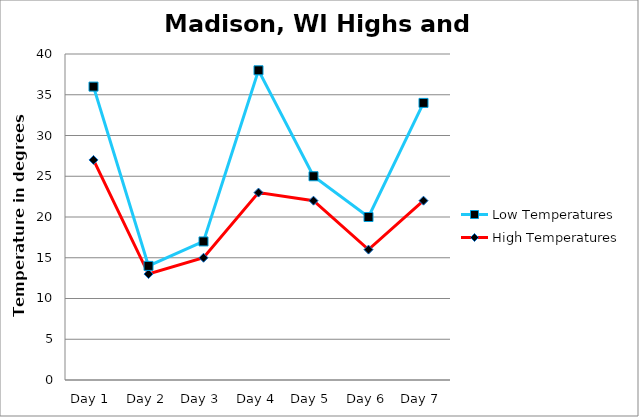
| Category | High Temperatures | Low Temperatures |
|---|---|---|
| Day 1 | 27 | 9 |
| Day 2 | 13 | 1 |
| Day 3 | 15 | 2 |
| Day 4 | 23 | 15 |
| Day 5 | 22 | 3 |
| Day 6 | 16 | 4 |
| Day 7 | 22 | 12 |